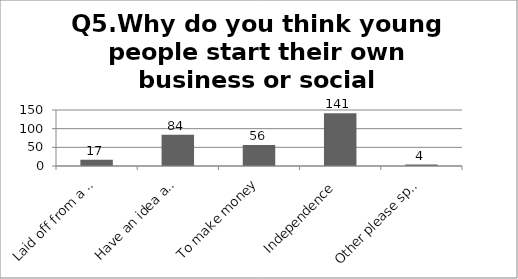
| Category | Q5.Why do you think young people start their own business or social enterprise? |
|---|---|
| Laid off from a company/unemployed | 17 |
| Have an idea and want to see it in action | 84 |
| To make money | 56 |
| Independence | 141 |
| Other please specify | 4 |